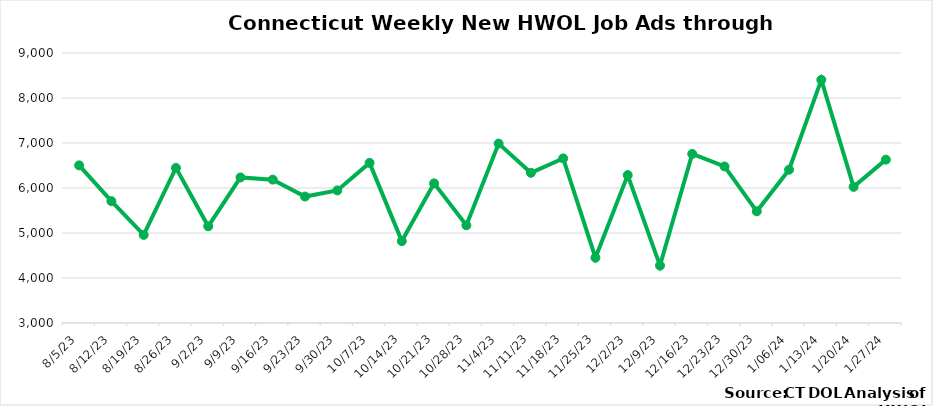
| Category | Connecticut |
|---|---|
| 8/5/23 | 6503 |
| 8/12/23 | 5708 |
| 8/19/23 | 4958 |
| 8/26/23 | 6447 |
| 9/2/23 | 5149 |
| 9/9/23 | 6235 |
| 9/16/23 | 6186 |
| 9/23/23 | 5810 |
| 9/30/23 | 5946 |
| 10/7/23 | 6558 |
| 10/14/23 | 4820 |
| 10/21/23 | 6103 |
| 10/28/23 | 5171 |
| 11/4/23 | 6987 |
| 11/11/23 | 6338 |
| 11/18/23 | 6658 |
| 11/25/23 | 4451 |
| 12/2/23 | 6286 |
| 12/9/23 | 4276 |
| 12/16/23 | 6757 |
|  12/23/23 | 6479 |
|  12/30/23 | 5482 |
|  1/06/24 | 6407 |
|  1/13/24 | 8403 |
|  1/20/24 | 6025 |
|  1/27/24 | 6630 |